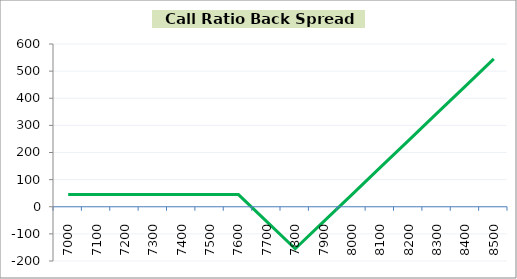
| Category | Series 1 |
|---|---|
| 7000.0 | 45 |
| 7100.0 | 45 |
| 7200.0 | 45 |
| 7300.0 | 45 |
| 7400.0 | 45 |
| 7500.0 | 45 |
| 7600.0 | 45 |
| 7700.0 | -55 |
| 7800.0 | -155 |
| 7900.0 | -55 |
| 8000.0 | 45 |
| 8100.0 | 145 |
| 8200.0 | 245 |
| 8300.0 | 345 |
| 8400.0 | 445 |
| 8500.0 | 545 |